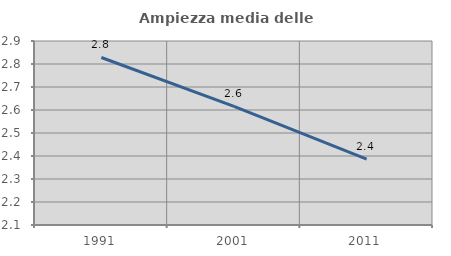
| Category | Ampiezza media delle famiglie |
|---|---|
| 1991.0 | 2.828 |
| 2001.0 | 2.616 |
| 2011.0 | 2.387 |